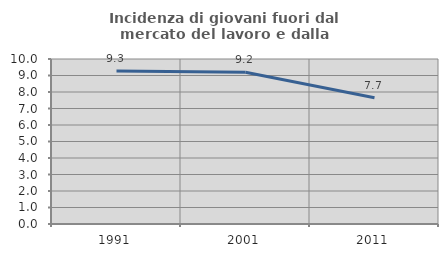
| Category | Incidenza di giovani fuori dal mercato del lavoro e dalla formazione  |
|---|---|
| 1991.0 | 9.275 |
| 2001.0 | 9.191 |
| 2011.0 | 7.657 |